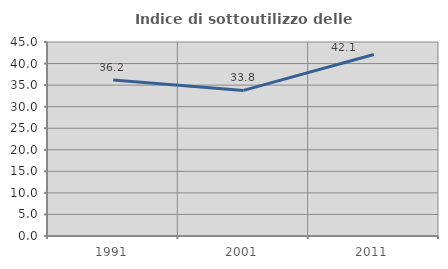
| Category | Indice di sottoutilizzo delle abitazioni  |
|---|---|
| 1991.0 | 36.174 |
| 2001.0 | 33.778 |
| 2011.0 | 42.094 |